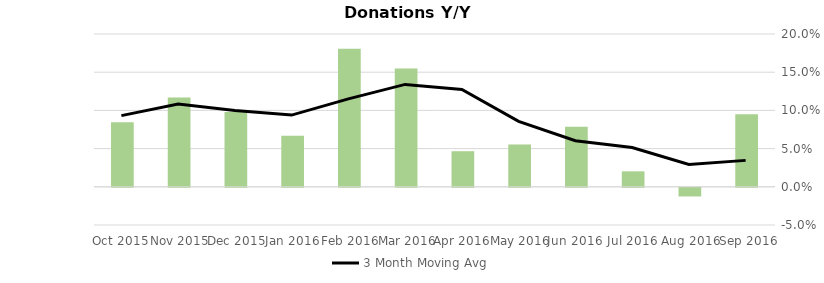
| Category | Donation Index Amount Y/Y Growth |
|---|---|
| Sep 2016 | 0.095 |
| Aug 2016 | -0.011 |
| Jul 2016 | 0.02 |
| Jun 2016 | 0.079 |
| May 2016 | 0.055 |
| Apr 2016 | 0.047 |
| Mar 2016 | 0.155 |
| Feb 2016 | 0.181 |
| Jan 2016 | 0.067 |
| Dec 2015 | 0.098 |
| Nov 2015 | 0.117 |
| Oct 2015 | 0.084 |